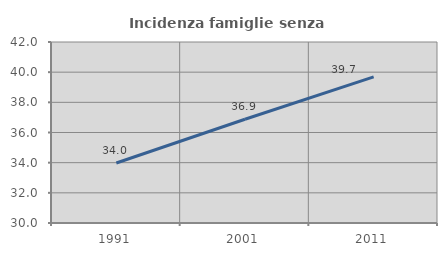
| Category | Incidenza famiglie senza nuclei |
|---|---|
| 1991.0 | 33.978 |
| 2001.0 | 36.881 |
| 2011.0 | 39.69 |